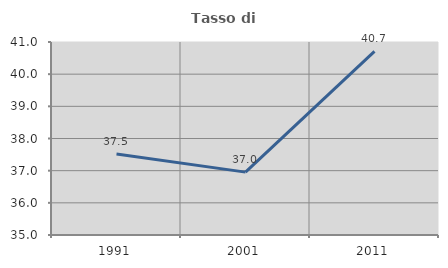
| Category | Tasso di occupazione   |
|---|---|
| 1991.0 | 37.518 |
| 2001.0 | 36.955 |
| 2011.0 | 40.708 |